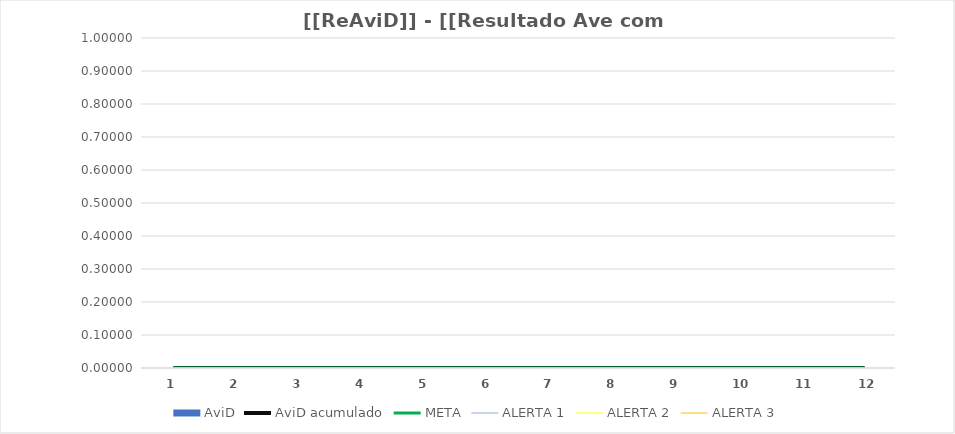
| Category | AviD |
|---|---|
| 0 | 0 |
| 1 | 0 |
| 2 | 0 |
| 3 | 0 |
| 4 | 0 |
| 5 | 0 |
| 6 | 0 |
| 7 | 0 |
| 8 | 0 |
| 9 | 0 |
| 10 | 0 |
| 11 | 0 |